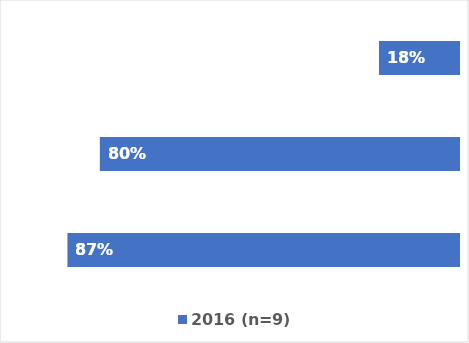
| Category | 2016 (n=9) |
|---|---|
| Listeria | 87.211 |
| STEC | 79.989 |
| Salmonella | 17.822 |